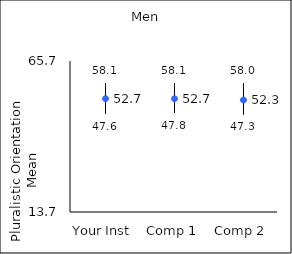
| Category | 25th percentile | 75th percentile | Mean |
|---|---|---|---|
| Your Inst | 47.6 | 58.1 | 52.73 |
| Comp 1 | 47.8 | 58.1 | 52.7 |
| Comp 2 | 47.3 | 58 | 52.25 |